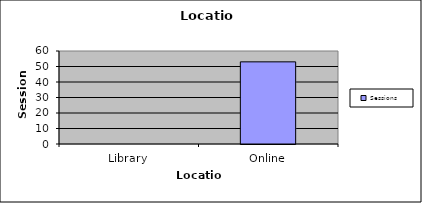
| Category | Sessions |
|---|---|
| Library | 0 |
| Online | 53 |